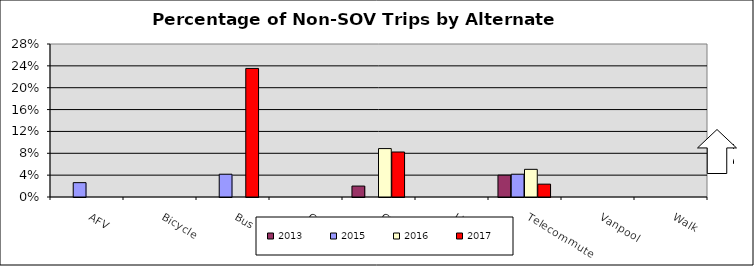
| Category | 2013 | 2015 | 2016 | 2017 |
|---|---|---|---|---|
| AFV | 0 | 0.026 | 0 | 0 |
| Bicycle | 0 | 0 | 0 | 0 |
| Bus | 0 | 0.042 | 0 | 0.235 |
| Carpool | 0 | 0 | 0 | 0 |
| CWW | 0.02 | 0 | 0.089 | 0.082 |
| Light Rail | 0 | 0 | 0 | 0 |
| Telecommute | 0.04 | 0.042 | 0.051 | 0.024 |
| Vanpool | 0 | 0 | 0 | 0 |
| Walk | 0 | 0 | 0 | 0 |